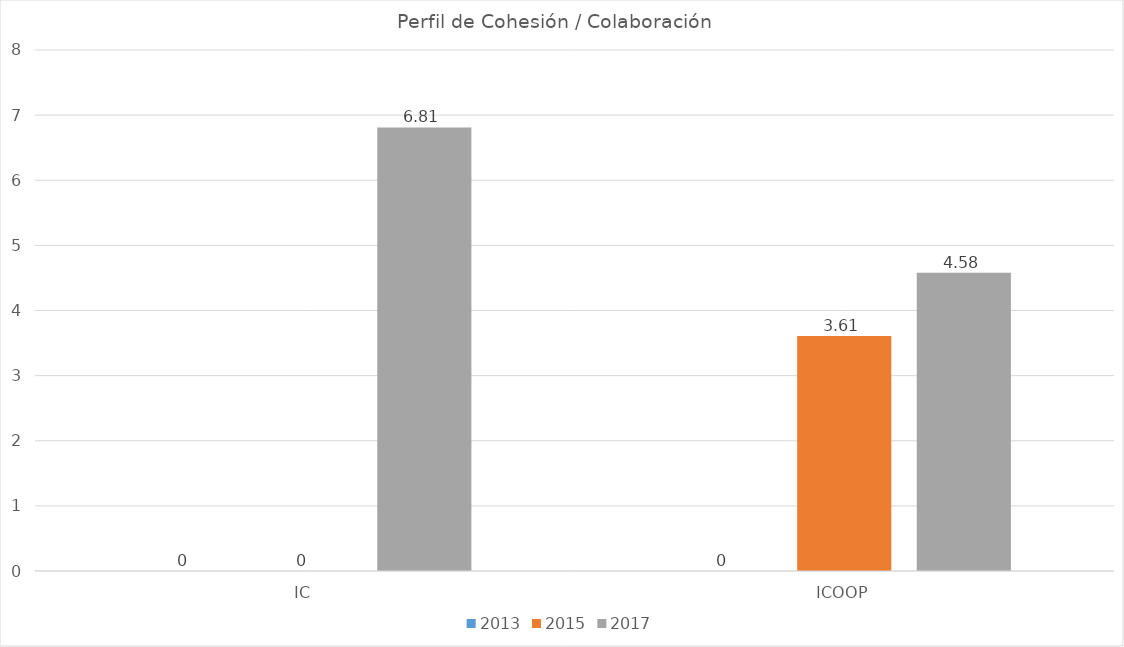
| Category | 2013 | 2015 | 2017 |
|---|---|---|---|
| IC | 0 | 0 | 6.81 |
| ICOOP | 0 | 3.61 | 4.58 |